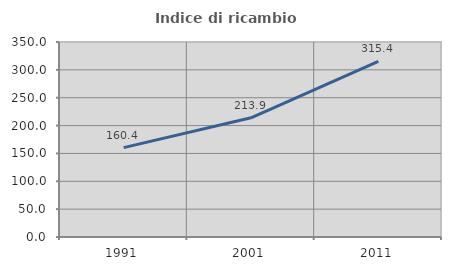
| Category | Indice di ricambio occupazionale  |
|---|---|
| 1991.0 | 160.432 |
| 2001.0 | 213.913 |
| 2011.0 | 315.436 |